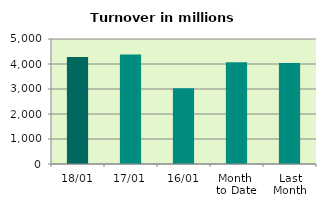
| Category | Series 0 |
|---|---|
| 18/01 | 4276.193 |
| 17/01 | 4376.821 |
| 16/01 | 3031.678 |
| Month 
to Date | 4067.051 |
| Last
Month | 4039.067 |